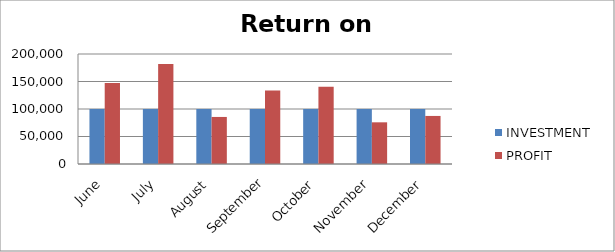
| Category | INVESTMENT  | PROFIT |
|---|---|---|
| June | 100000 | 147454 |
| July | 100000 | 181784 |
| August | 100000 | 85543 |
| September | 100000 | 133590 |
| October | 100000 | 140368 |
| November | 100000 | 75780 |
| December | 100000 | 87377 |